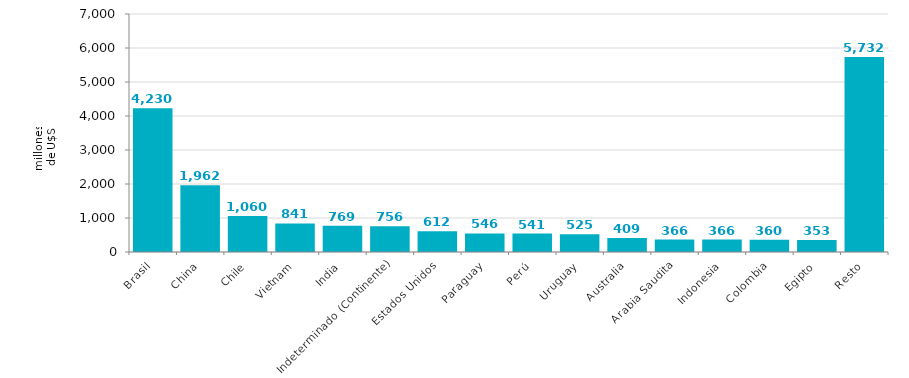
| Category | Series 0 |
|---|---|
| Brasil | 4229.914 |
| China | 1961.945 |
| Chile | 1059.552 |
| Vietnam | 840.764 |
| India | 769.202 |
| Indeterminado (Continente) | 756.116 |
| Estados Unidos | 612.077 |
| Paraguay | 546.235 |
| Perú | 541.033 |
| Uruguay | 524.702 |
| Australia | 409.372 |
| Arabia Saudita | 366.086 |
| Indonesia | 365.885 |
| Colombia | 360.361 |
| Egipto | 352.931 |
| Resto | 5732.161 |